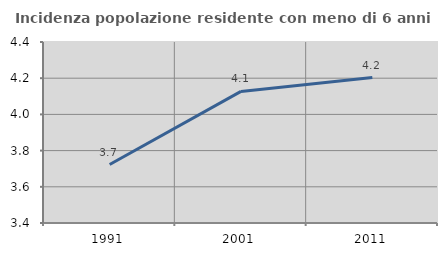
| Category | Incidenza popolazione residente con meno di 6 anni |
|---|---|
| 1991.0 | 3.723 |
| 2001.0 | 4.127 |
| 2011.0 | 4.203 |